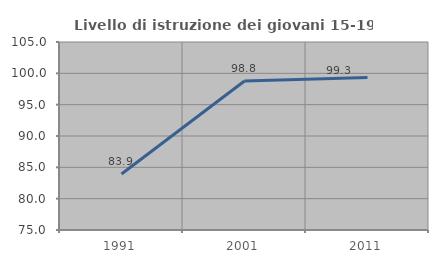
| Category | Livello di istruzione dei giovani 15-19 anni |
|---|---|
| 1991.0 | 83.936 |
| 2001.0 | 98.77 |
| 2011.0 | 99.338 |